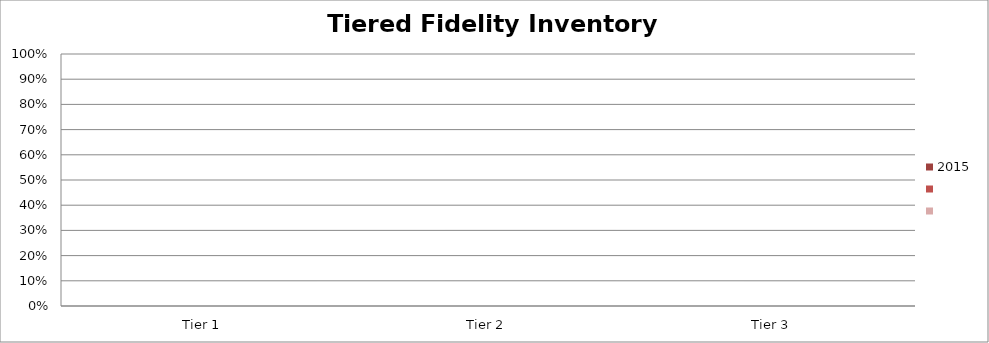
| Category | 2015 | Series 1 | Series 2 |
|---|---|---|---|
| Tier 1 | 0 |  |  |
| Tier 2 | 0 |  |  |
| Tier 3 | 0 |  |  |